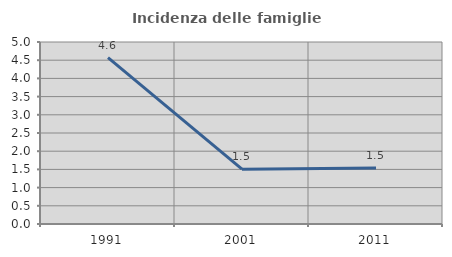
| Category | Incidenza delle famiglie numerose |
|---|---|
| 1991.0 | 4.571 |
| 2001.0 | 1.508 |
| 2011.0 | 1.536 |